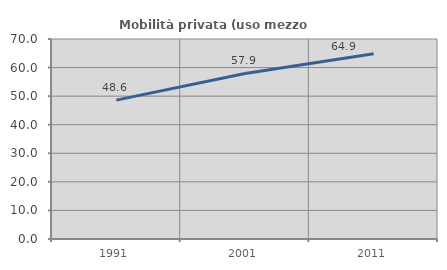
| Category | Mobilità privata (uso mezzo privato) |
|---|---|
| 1991.0 | 48.598 |
| 2001.0 | 57.944 |
| 2011.0 | 64.865 |